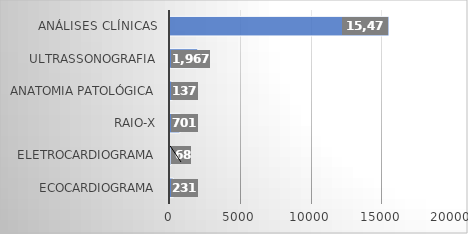
| Category | Series 0 |
|---|---|
| ECOCARDIOGRAMA | 231 |
| ELETROCARDIOGRAMA | 68 |
| RAIO-X | 701 |
| ANATOMIA PATOLÓGICA | 137 |
| ULTRASSONOGRAFIA | 1967 |
| ANÁLISES CLÍNICAS | 15476 |